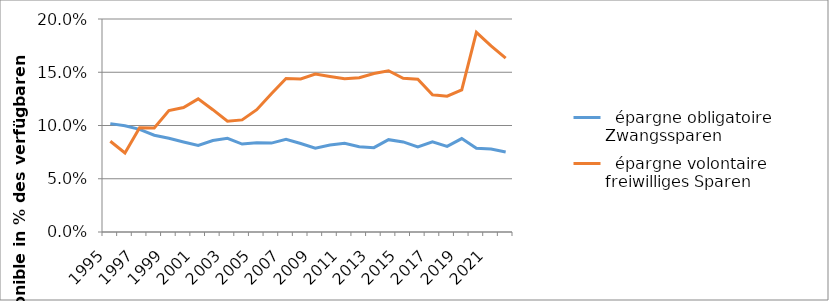
| Category |   épargne obligatoire |   épargne volontaire |
|---|---|---|
| 1995 | 0.102 | 0.085 |
| 1996 | 0.1 | 0.074 |
| 1997 | 0.096 | 0.098 |
| 1998 | 0.091 | 0.098 |
| 1999 | 0.088 | 0.114 |
| 2000 | 0.085 | 0.117 |
| 2001 | 0.081 | 0.125 |
| 2002 | 0.086 | 0.115 |
| 2003 | 0.088 | 0.104 |
| 2004 | 0.083 | 0.105 |
| 2005 | 0.084 | 0.115 |
| 2006 | 0.083 | 0.13 |
| 2007 | 0.087 | 0.144 |
| 2008 | 0.083 | 0.144 |
| 2009 | 0.079 | 0.148 |
| 2010 | 0.082 | 0.146 |
| 2011 | 0.083 | 0.144 |
| 2012 | 0.08 | 0.145 |
| 2013 | 0.079 | 0.149 |
| 2014 | 0.087 | 0.151 |
| 2015 | 0.085 | 0.144 |
| 2016 | 0.08 | 0.144 |
| 2017 | 0.085 | 0.129 |
| 2018 | 0.08 | 0.128 |
| 2019 | 0.088 | 0.133 |
| 2020 | 0.079 | 0.187 |
| 2021 | 0.078 | 0.175 |
| 2022 | 0.075 | 0.163 |